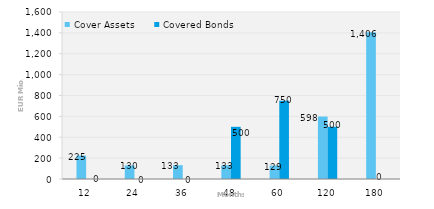
| Category | Cover Assets | Covered Bonds |
|---|---|---|
| 12.0 | 224.986 | 0 |
| 24.0 | 129.946 | 0 |
| 36.0 | 132.552 | 0 |
| 48.0 | 132.788 | 500 |
| 60.0 | 128.538 | 750 |
| 120.0 | 598.468 | 500 |
| 180.0 | 1405.786 | 0 |